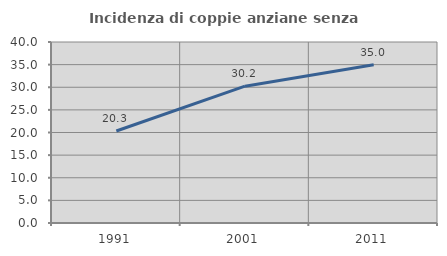
| Category | Incidenza di coppie anziane senza figli  |
|---|---|
| 1991.0 | 20.339 |
| 2001.0 | 30.239 |
| 2011.0 | 34.985 |